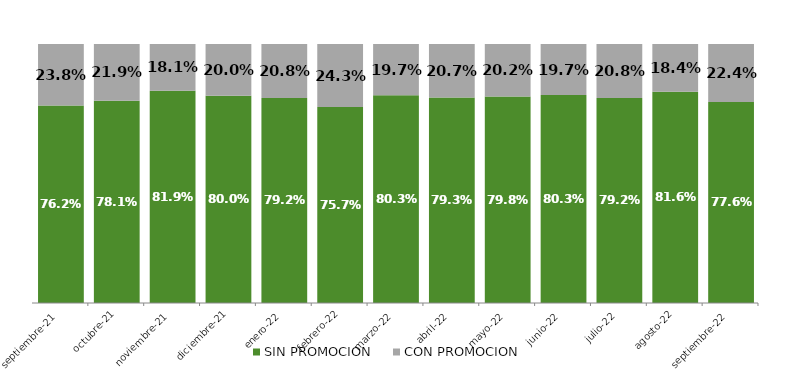
| Category | SIN PROMOCION   | CON PROMOCION   |
|---|---|---|
| 2021-09-01 | 0.762 | 0.238 |
| 2021-10-01 | 0.781 | 0.219 |
| 2021-11-01 | 0.819 | 0.181 |
| 2021-12-01 | 0.8 | 0.2 |
| 2022-01-01 | 0.792 | 0.208 |
| 2022-02-01 | 0.757 | 0.243 |
| 2022-03-01 | 0.803 | 0.197 |
| 2022-04-01 | 0.793 | 0.207 |
| 2022-05-01 | 0.798 | 0.202 |
| 2022-06-01 | 0.803 | 0.197 |
| 2022-07-01 | 0.792 | 0.208 |
| 2022-08-01 | 0.816 | 0.184 |
| 2022-09-01 | 0.776 | 0.224 |